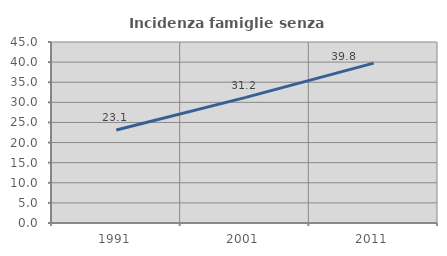
| Category | Incidenza famiglie senza nuclei |
|---|---|
| 1991.0 | 23.113 |
| 2001.0 | 31.168 |
| 2011.0 | 39.76 |